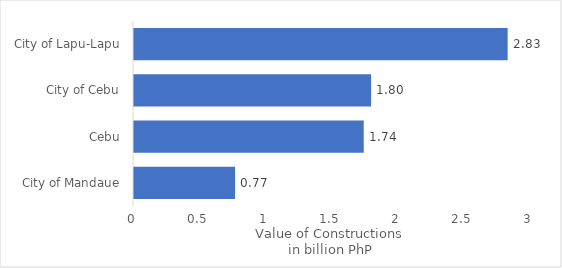
| Category | Value of Cons |
|---|---|
| City of Mandaue | 0.766 |
| Cebu | 1.74 |
| City of Cebu | 1.796 |
| City of Lapu-Lapu | 2.831 |